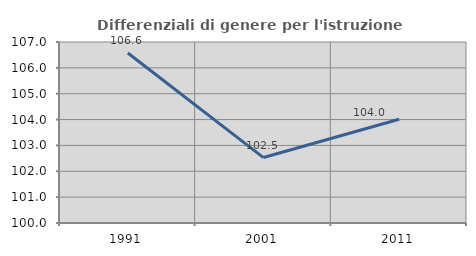
| Category | Differenziali di genere per l'istruzione superiore |
|---|---|
| 1991.0 | 106.577 |
| 2001.0 | 102.531 |
| 2011.0 | 104.012 |